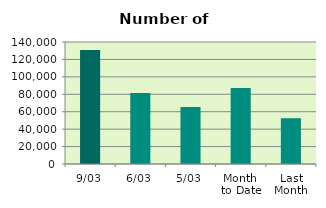
| Category | Series 0 |
|---|---|
| 9/03 | 130938 |
| 6/03 | 81496 |
| 5/03 | 65442 |
| Month 
to Date | 87223.667 |
| Last
Month | 52501.6 |